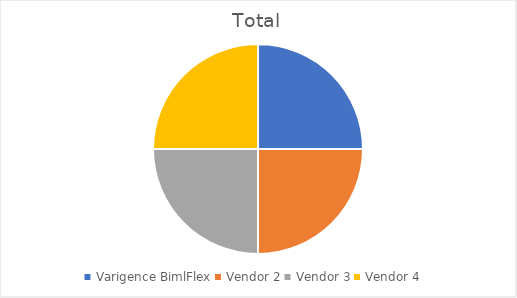
| Category | Total |
|---|---|
| Varigence BimlFlex | 2 |
| Vendor 2 | 2 |
| Vendor 3 | 2 |
| Vendor 4 | 2 |